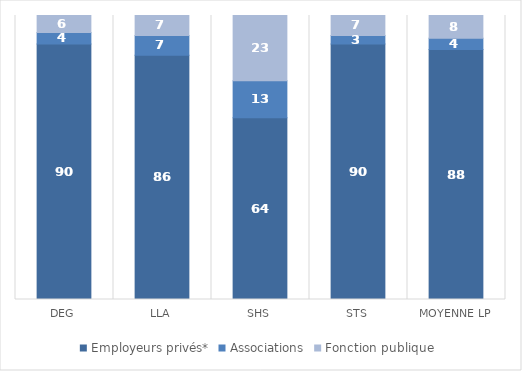
| Category | Employeurs privés* | Associations | Fonction publique |
|---|---|---|---|
| DEG | 90 | 4 | 6 |
| LLA | 86 | 7 | 7 |
| SHS | 64 | 13 | 23 |
| STS | 90 | 3 | 7 |
| Moyenne LP | 88 | 4 | 8 |